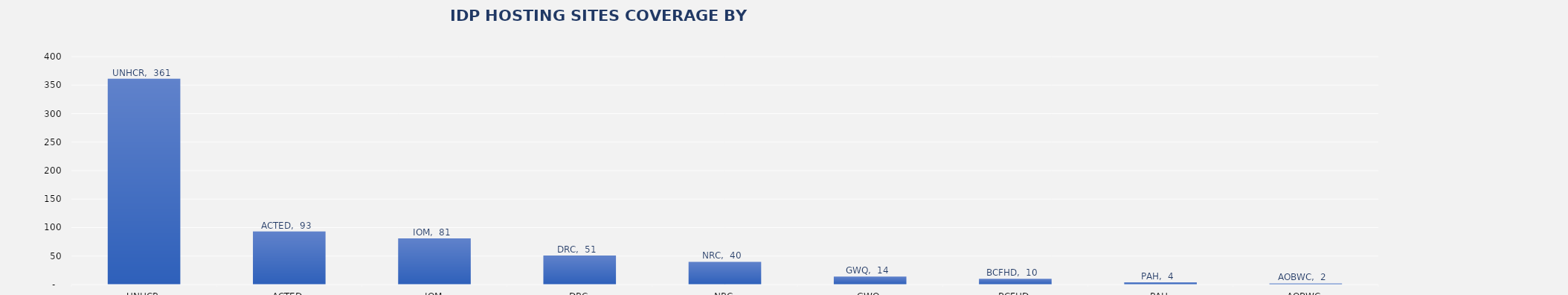
| Category | Total |
|---|---|
| UNHCR | 361 |
| ACTED | 93 |
| IOM | 81 |
| DRC | 51 |
| NRC | 40 |
| GWQ | 14 |
| BCFHD | 10 |
| PAH | 4 |
| AOBWC | 2 |